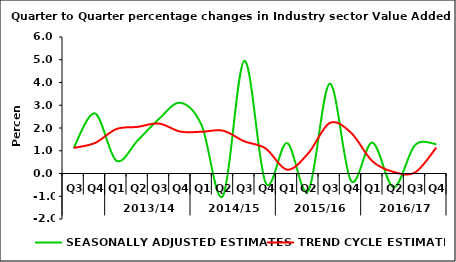
| Category | SEASONALLY ADJUSTED ESTIMATES | TREND CYCLE ESTIMATES |
|---|---|---|
| 0 | 1.132 | 1.125 |
| 1 | 2.642 | 1.342 |
| 2 | 0.565 | 1.953 |
| 3 | 1.452 | 2.051 |
| 4 | 2.4 | 2.195 |
| 5 | 3.112 | 1.841 |
| 6 | 2.114 | 1.835 |
| 7 | -0.985 | 1.882 |
| 8 | 4.951 | 1.414 |
| 9 | -0.413 | 1.1 |
| 10 | 1.34 | 0.169 |
| 11 | -0.769 | 0.889 |
| 12 | 3.946 | 2.22 |
| 13 | -0.32 | 1.794 |
| 14 | 1.359 | 0.542 |
| 15 | -0.602 | 0.068 |
| 16 | 1.247 | 0.045 |
| 17 | 1.29 | 1.139 |